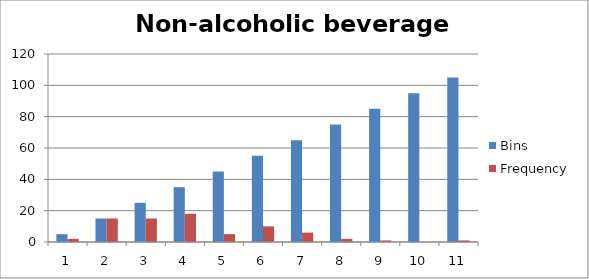
| Category | Bins | Frequency |
|---|---|---|
| 0 | 5 | 2 |
| 1 | 15 | 15 |
| 2 | 25 | 15 |
| 3 | 35 | 18 |
| 4 | 45 | 5 |
| 5 | 55 | 10 |
| 6 | 65 | 6 |
| 7 | 75 | 2 |
| 8 | 85 | 1 |
| 9 | 95 | 0 |
| 10 | 105 | 1 |